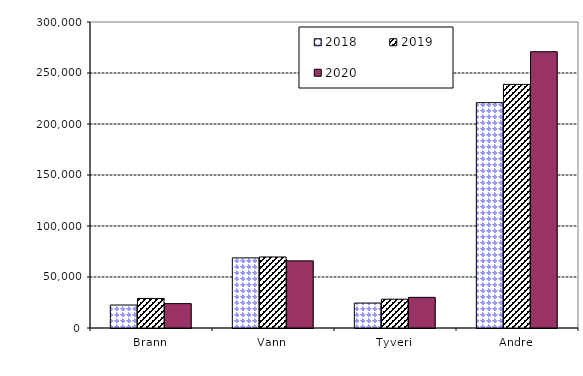
| Category | 2018 | 2019 | 2020 |
|---|---|---|---|
| Brann | 22519.979 | 28972.993 | 23897.272 |
| Vann | 68720.093 | 69652.37 | 65851.136 |
| Tyveri | 24478.981 | 28235.61 | 30032.017 |
| Andre | 220900.126 | 238829.967 | 270870.856 |